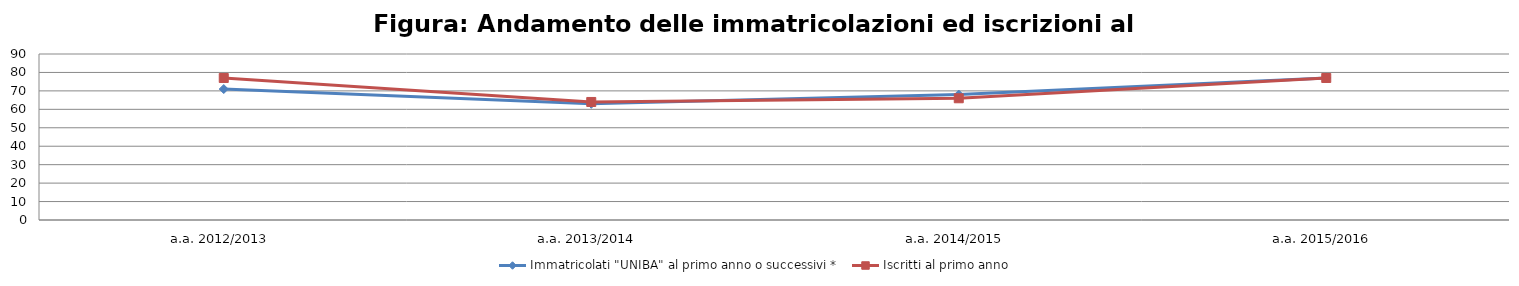
| Category | Immatricolati "UNIBA" al primo anno o successivi * | Iscritti al primo anno  |
|---|---|---|
| a.a. 2012/2013 | 71 | 77 |
| a.a. 2013/2014 | 63 | 64 |
| a.a. 2014/2015 | 68 | 66 |
| a.a. 2015/2016 | 77 | 77 |